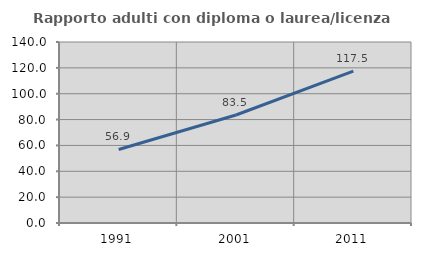
| Category | Rapporto adulti con diploma o laurea/licenza media  |
|---|---|
| 1991.0 | 56.879 |
| 2001.0 | 83.525 |
| 2011.0 | 117.524 |